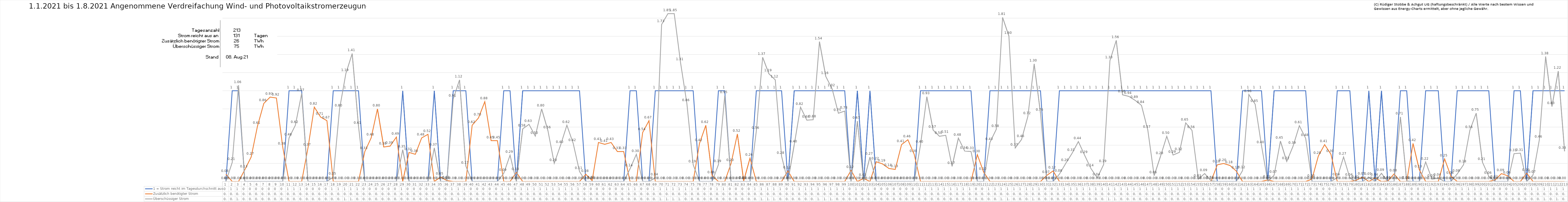
| Category | 1 = Strom reicht im Tagesdurchschnitt aus | Zusätzlich benötigter Strom | Überschüssiger Strom |
|---|---|---|---|
| 0 | 0 | 0.08 | 0 |
| 1 | 1 | 0 | 0.21 |
| 2 | 1 | 0 | 1.06 |
| 3 | 0 | 0.13 | 0 |
| 4 | 0 | 0.27 | 0 |
| 5 | 0 | 0.61 | 0 |
| 6 | 0 | 0.86 | 0 |
| 7 | 0 | 0.93 | 0 |
| 8 | 0 | 0.92 | 0 |
| 9 | 0 | 0.38 | 0 |
| 10 | 1 | 0 | 0.48 |
| 11 | 1 | 0 | 0.62 |
| 12 | 1 | 0 | 0.97 |
| 13 | 0 | 0.37 | 0 |
| 14 | 0 | 0.82 | 0 |
| 15 | 0 | 0.71 | 0 |
| 16 | 0 | 0.67 | 0 |
| 17 | 1 | 0 | 0.05 |
| 18 | 1 | 0 | 0.8 |
| 19 | 1 | 0 | 1.19 |
| 20 | 1 | 0 | 1.41 |
| 21 | 1 | 0 | 0.61 |
| 22 | 0 | 0.33 | 0 |
| 23 | 0 | 0.48 | 0 |
| 24 | 0 | 0.8 | 0 |
| 25 | 0 | 0.38 | 0 |
| 26 | 0 | 0.39 | 0 |
| 27 | 0 | 0.49 | 0 |
| 28 | 1 | 0 | 0.35 |
| 29 | 0 | 0.32 | 0 |
| 30 | 0 | 0.3 | 0 |
| 31 | 0 | 0.48 | 0 |
| 32 | 0 | 0.52 | 0 |
| 33 | 1 | 0 | 0.37 |
| 34 | 0 | 0.05 | 0 |
| 35 | 0 | 0.01 | 0 |
| 36 | 1 | 0 | 0.91 |
| 37 | 1 | 0 | 1.12 |
| 38 | 1 | 0 | 0.17 |
| 39 | 0 | 0.62 | 0 |
| 40 | 0 | 0.7 | 0 |
| 41 | 0 | 0.88 | 0 |
| 42 | 0 | 0.45 | 0 |
| 43 | 0 | 0.45 | 0 |
| 44 | 1 | 0 | 0.09 |
| 45 | 1 | 0 | 0.29 |
| 46 | 0 | 0.1 | 0 |
| 47 | 1 | 0 | 0.58 |
| 48 | 1 | 0 | 0.63 |
| 49 | 1 | 0 | 0.5 |
| 50 | 1 | 0 | 0.8 |
| 51 | 1 | 0 | 0.56 |
| 52 | 1 | 0 | 0.2 |
| 53 | 1 | 0 | 0.4 |
| 54 | 1 | 0 | 0.62 |
| 55 | 1 | 0 | 0.42 |
| 56 | 1 | 0 | 0.11 |
| 57 | 0 | 0.08 | 0 |
| 58 | 0 | 0.01 | 0 |
| 59 | 0 | 0.43 | 0 |
| 60 | 0 | 0.41 | 0 |
| 61 | 0 | 0.43 | 0 |
| 62 | 0 | 0.33 | 0 |
| 63 | 0 | 0.33 | 0 |
| 64 | 1 | 0 | 0.14 |
| 65 | 1 | 0 | 0.3 |
| 66 | 0 | 0.54 | 0 |
| 67 | 0 | 0.67 | 0 |
| 68 | 1 | 0 | 0.04 |
| 69 | 1 | 0 | 1.73 |
| 70 | 1 | 0 | 1.85 |
| 71 | 1 | 0 | 1.85 |
| 72 | 1 | 0 | 1.31 |
| 73 | 1 | 0 | 0.861 |
| 74 | 1 | 0 | 0.185 |
| 75 | 0 | 0.42 | 0 |
| 76 | 0 | 0.619 | 0 |
| 77 | 0 | 0.064 | 0 |
| 78 | 1 | 0 | 0.187 |
| 79 | 1 | 0 | 0.946 |
| 80 | 0 | 0.198 | 0 |
| 81 | 0 | 0.523 | 0 |
| 82 | 0 | 0.007 | 0 |
| 83 | 0 | 0.257 | 0 |
| 84 | 1 | 0 | 0.555 |
| 85 | 1 | 0 | 1.369 |
| 86 | 1 | 0 | 1.186 |
| 87 | 1 | 0 | 1.12 |
| 88 | 1 | 0 | 0.278 |
| 89 | 0 | 0.117 | 0 |
| 90 | 1 | 0 | 0.403 |
| 91 | 1 | 0 | 0.819 |
| 92 | 1 | 0 | 0.676 |
| 93 | 1 | 0 | 0.681 |
| 94 | 1 | 0 | 1.541 |
| 95 | 1 | 0 | 1.158 |
| 96 | 1 | 0 | 1.022 |
| 97 | 1 | 0 | 0.752 |
| 98 | 1 | 0 | 0.776 |
| 99 | 0 | 0.123 | 0 |
| 100 | 1 | 0 | 0.665 |
| 101 | 0 | 0.034 | 0 |
| 102 | 1 | 0 | 0.269 |
| 103 | 0 | 0.218 | 0 |
| 104 | 0 | 0.193 | 0 |
| 105 | 0 | 0.144 | 0 |
| 106 | 0 | 0.133 | 0 |
| 107 | 0 | 0.407 | 0 |
| 108 | 0 | 0.46 | 0 |
| 109 | 0 | 0.3 | 0 |
| 110 | 1 | 0 | 0.402 |
| 111 | 1 | 0 | 0.934 |
| 112 | 1 | 0 | 0.567 |
| 113 | 1 | 0 | 0.498 |
| 114 | 1 | 0 | 0.509 |
| 115 | 1 | 0 | 0.167 |
| 116 | 1 | 0 | 0.478 |
| 117 | 1 | 0 | 0.336 |
| 118 | 1 | 0 | 0.331 |
| 119 | 0 | 0.296 | 0 |
| 120 | 0 | 0.103 | 0 |
| 121 | 1 | 0 | 0.432 |
| 122 | 1 | 0 | 0.575 |
| 123 | 1 | 0 | 1.808 |
| 124 | 1 | 0 | 1.602 |
| 125 | 1 | 0 | 0.369 |
| 126 | 1 | 0 | 0.463 |
| 127 | 1 | 0 | 0.716 |
| 128 | 1 | 0 | 1.296 |
| 129 | 1 | 0 | 0.755 |
| 130 | 0 | 0.067 | 0 |
| 131 | 0 | 0.117 | 0 |
| 132 | 1 | 0 | 0.081 |
| 133 | 1 | 0 | 0.2 |
| 134 | 1 | 0 | 0.31 |
| 135 | 1 | 0 | 0.44 |
| 136 | 1 | 0 | 0.289 |
| 137 | 1 | 0 | 0.142 |
| 138 | 1 | 0 | 0.041 |
| 139 | 1 | 0 | 0.186 |
| 140 | 1 | 0 | 1.332 |
| 141 | 1 | 0 | 1.555 |
| 142 | 1 | 0 | 0.955 |
| 143 | 1 | 0 | 0.938 |
| 144 | 1 | 0 | 0.894 |
| 145 | 1 | 0 | 0.838 |
| 146 | 1 | 0 | 0.567 |
| 147 | 1 | 0 | 0.064 |
| 148 | 1 | 0 | 0.276 |
| 149 | 1 | 0 | 0.498 |
| 150 | 1 | 0 | 0.292 |
| 151 | 1 | 0 | 0.321 |
| 152 | 1 | 0 | 0.646 |
| 153 | 1 | 0 | 0.563 |
| 154 | 1 | 0 | 0.026 |
| 155 | 1 | 0 | 0.087 |
| 156 | 1 | 0 | 0.009 |
| 157 | 0 | 0.184 | 0 |
| 158 | 0 | 0.199 | 0 |
| 159 | 0 | 0.177 | 0 |
| 160 | 0 | 0.116 | 0 |
| 161 | 1 | 0 | 0.12 |
| 162 | 1 | 0 | 0.959 |
| 163 | 1 | 0 | 0.851 |
| 164 | 1 | 0 | 0.397 |
| 165 | 0 | 0.017 | 0 |
| 166 | 1 | 0 | 0.069 |
| 167 | 1 | 0 | 0.445 |
| 168 | 1 | 0 | 0.221 |
| 169 | 1 | 0 | 0.389 |
| 170 | 1 | 0 | 0.615 |
| 171 | 1 | 0 | 0.476 |
| 172 | 0 | 0.027 | 0 |
| 173 | 0 | 0.28 | 0 |
| 174 | 0 | 0.406 | 0 |
| 175 | 0 | 0.3 | 0 |
| 176 | 1 | 0 | 0.042 |
| 177 | 1 | 0 | 0.271 |
| 178 | 1 | 0 | 0.038 |
| 179 | 0 | 0.014 | 0 |
| 180 | 0 | 0.049 | 0 |
| 181 | 1 | 0 | 0.046 |
| 182 | 0 | 0.038 | 0 |
| 183 | 1 | 0 | 0.09 |
| 184 | 0 | 0.005 | 0 |
| 185 | 0 | 0.084 | 0 |
| 186 | 1 | 0 | 0.711 |
| 187 | 1 | 0 | 0.006 |
| 188 | 0 | 0.419 | 0 |
| 189 | 0 | 0.129 | 0 |
| 190 | 1 | 0 | 0.215 |
| 191 | 1 | 0 | 0.026 |
| 192 | 1 | 0 | 0.038 |
| 193 | 0 | 0.249 | 0 |
| 194 | 0 | 0.057 | 0 |
| 195 | 1 | 0 | 0.084 |
| 196 | 1 | 0 | 0.185 |
| 197 | 1 | 0 | 0.563 |
| 198 | 1 | 0 | 0.753 |
| 199 | 1 | 0 | 0.212 |
| 200 | 1 | 0 | 0.058 |
| 201 | 0 | 0.018 | 0 |
| 202 | 0 | 0.087 | 0 |
| 203 | 0 | 0.063 | 0 |
| 204 | 1 | 0 | 0.307 |
| 205 | 1 | 0 | 0.312 |
| 206 | 0 | 0.092 | 0 |
| 207 | 1 | 0 | 0.071 |
| 208 | 1 | 0 | 0.458 |
| 209 | 1 | 0 | 1.377 |
| 210 | 1 | 0 | 0.826 |
| 211 | 1 | 0 | 1.216 |
| 212 | 1 | 0 | 0.333 |